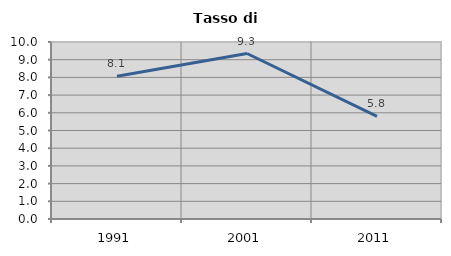
| Category | Tasso di disoccupazione   |
|---|---|
| 1991.0 | 8.065 |
| 2001.0 | 9.35 |
| 2011.0 | 5.797 |